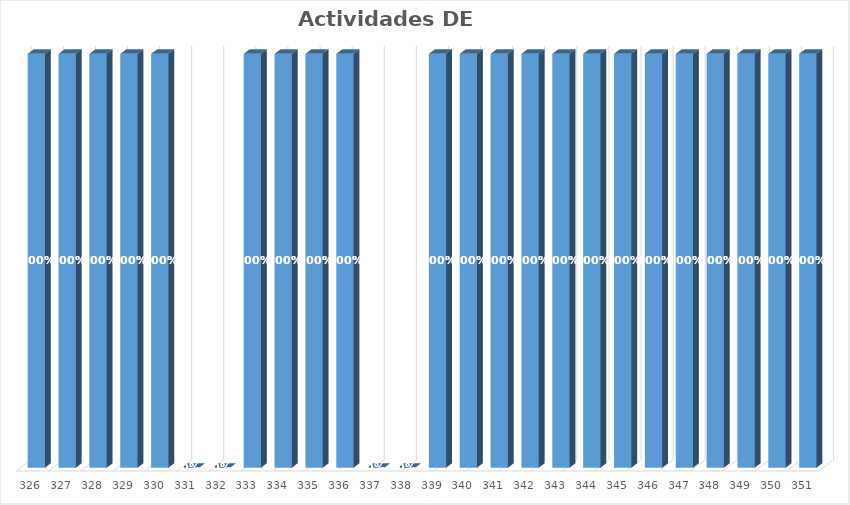
| Category | % Avance |
|---|---|
| 326.0 | 1 |
| 327.0 | 1 |
| 328.0 | 1 |
| 329.0 | 1 |
| 330.0 | 1 |
| 331.0 | 0 |
| 332.0 | 0 |
| 333.0 | 1 |
| 334.0 | 1 |
| 335.0 | 1 |
| 336.0 | 1 |
| 337.0 | 0 |
| 338.0 | 0 |
| 339.0 | 1 |
| 340.0 | 1 |
| 341.0 | 1 |
| 342.0 | 1 |
| 343.0 | 1 |
| 344.0 | 1 |
| 345.0 | 1 |
| 346.0 | 1 |
| 347.0 | 1 |
| 348.0 | 1 |
| 349.0 | 1 |
| 350.0 | 1 |
| 351.0 | 1 |